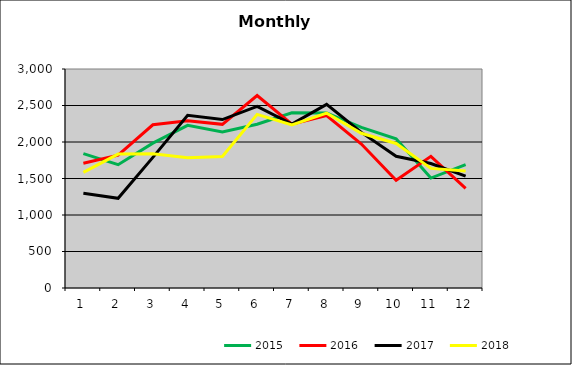
| Category | 2015 | 2016 | 2017 | 2018 |
|---|---|---|---|---|
| 0 | 1840.287 | 1709.692 | 1297.347 | 1584.945 |
| 1 | 1689.437 | 1818.591 | 1228.546 | 1834.566 |
| 2 | 1984.247 | 2235.971 | 1789.782 | 1838.878 |
| 3 | 2228.645 | 2290.052 | 2364.914 | 1785.082 |
| 4 | 2137.722 | 2241.602 | 2307.576 | 1801.761 |
| 5 | 2243.789 | 2636.687 | 2488.575 | 2378.145 |
| 6 | 2399.136 | 2245.31 | 2244.746 | 2232.373 |
| 7 | 2398.707 | 2362.2 | 2515.952 | 2394.922 |
| 8 | 2201.336 | 1971.49 | 2131.972 | 2119.853 |
| 9 | 2044.473 | 1477.1 | 1804.009 | 1979.952 |
| 10 | 1505.745 | 1802.993 | 1705.861 | 1638.435 |
| 11 | 1689.497 | 1366.089 | 1533.212 | 1603.694 |